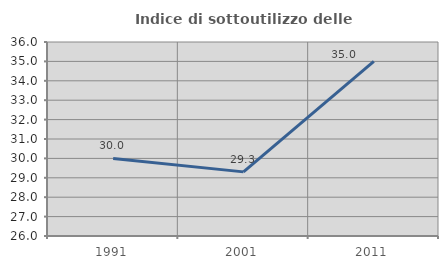
| Category | Indice di sottoutilizzo delle abitazioni  |
|---|---|
| 1991.0 | 30 |
| 2001.0 | 29.305 |
| 2011.0 | 35 |